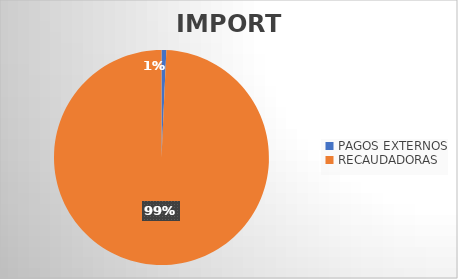
| Category | IMPORTE |
|---|---|
| PAGOS EXTERNOS | 1299361.4 |
| RECAUDADORAS | 178320160.73 |